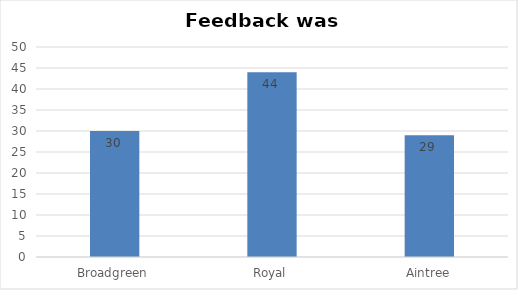
| Category | Series 0 |
|---|---|
| Broadgreen | 30 |
| Royal | 44 |
| Aintree | 29 |